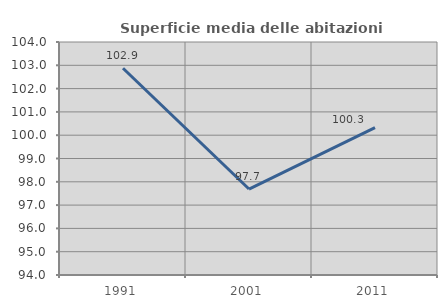
| Category | Superficie media delle abitazioni occupate |
|---|---|
| 1991.0 | 102.872 |
| 2001.0 | 97.69 |
| 2011.0 | 100.325 |